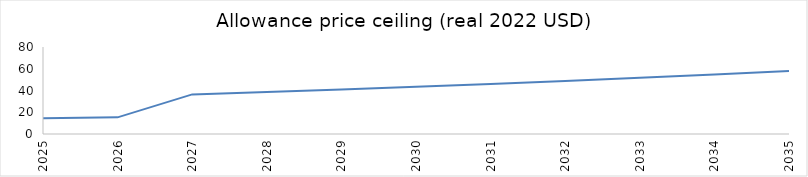
| Category | Series 0 |
|---|---|
| 2025.0 | 14.566 |
| 2026.0 | 15.294 |
| 2027.0 | 36.414 |
| 2028.0 | 38.599 |
| 2029.0 | 40.915 |
| 2030.0 | 43.37 |
| 2031.0 | 45.972 |
| 2032.0 | 48.73 |
| 2033.0 | 51.654 |
| 2034.0 | 54.753 |
| 2035.0 | 58.038 |